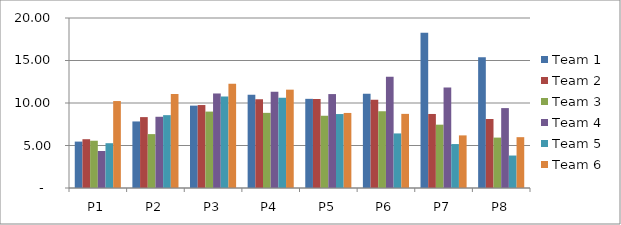
| Category | Team 1 | Team 2 | Team 3 | Team 4 | Team 5 | Team 6 |
|---|---|---|---|---|---|---|
| P1 | 5.46 | 5.74 | 5.56 | 4.35 | 5.27 | 10.23 |
| P2 | 7.83 | 8.34 | 6.34 | 8.38 | 8.57 | 11.05 |
| P3 | 9.69 | 9.76 | 8.99 | 11.12 | 10.77 | 12.27 |
| P4 | 10.96 | 10.45 | 8.84 | 11.31 | 10.61 | 11.57 |
| P5 | 10.49 | 10.48 | 8.5 | 11.05 | 8.7 | 8.83 |
| P6 | 11.1 | 10.38 | 9.03 | 13.09 | 6.42 | 8.72 |
| P7 | 18.26 | 8.71 | 7.45 | 11.82 | 5.17 | 6.19 |
| P8 | 15.39 | 8.12 | 5.93 | 9.4 | 3.82 | 5.98 |